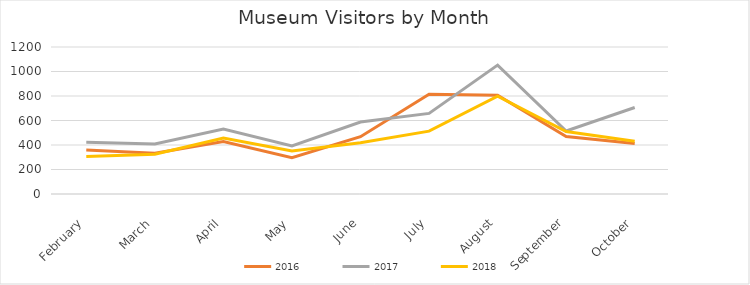
| Category | 2016 | 2017 | 2018 |
|---|---|---|---|
| February | 359 | 422 | 306 |
| March | 332 | 408 | 325 |
| April | 429 | 531 | 457 |
| May | 297 | 393 | 352 |
| June | 468 | 587 | 419 |
| July | 815 | 658 | 513 |
| August | 807 | 1052 | 798 |
| September | 470 | 514 | 510 |
| October | 413 | 706 | 430 |